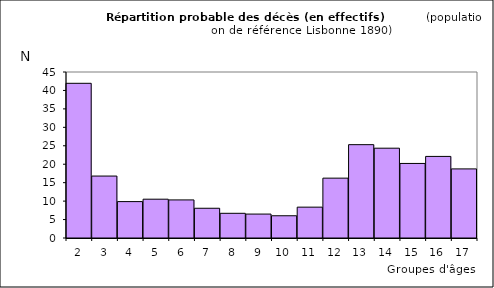
| Category | Series 0 |
|---|---|
| 2.0 | 41.934 |
| 3.0 | 16.793 |
| 4.0 | 9.866 |
| 5.0 | 10.517 |
| 6.0 | 10.326 |
| 7.0 | 8.065 |
| 8.0 | 6.693 |
| 9.0 | 6.485 |
| 10.0 | 6.028 |
| 11.0 | 8.362 |
| 12.0 | 16.227 |
| 13.0 | 25.301 |
| 14.0 | 24.347 |
| 15.0 | 20.211 |
| 16.0 | 22.115 |
| 17.0 | 18.731 |